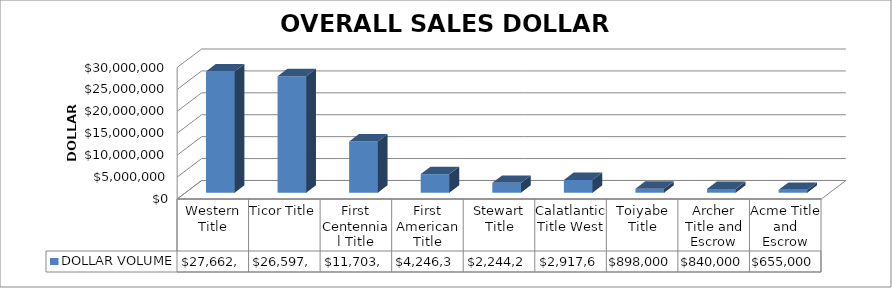
| Category | DOLLAR VOLUME |
|---|---|
| Western Title | 27662201.75 |
| Ticor Title | 26597324 |
| First Centennial Title | 11703245 |
| First American Title | 4246315 |
| Stewart Title | 2244280 |
| Calatlantic Title West | 2917689 |
| Toiyabe Title | 898000 |
| Archer Title and Escrow | 840000 |
| Acme Title and Escrow | 655000 |